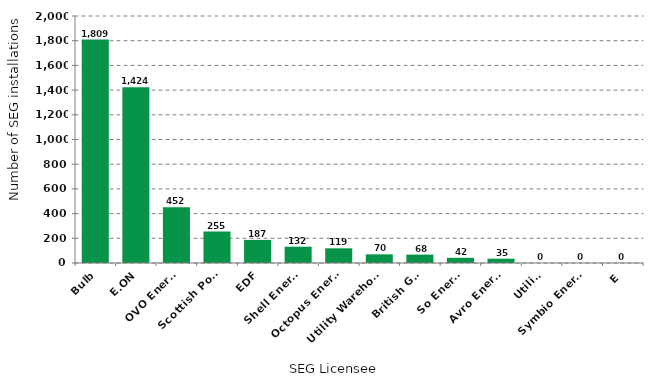
| Category | Series 0 |
|---|---|
| Bulb | 1809 |
| E.ON | 1424 |
| OVO Energy | 452 |
| Scottish Power | 255 |
| EDF | 187 |
| Shell Energy | 132 |
| Octopus Energy | 119 |
| Utility Warehouse | 70 |
| British Gas | 68 |
| So Energy | 42 |
| Avro Energy | 35 |
| Utilita | 0 |
| Symbio Energy | 0 |
| E | 0 |